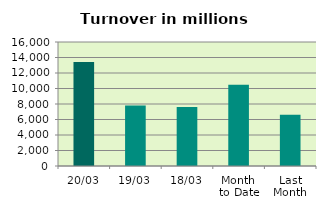
| Category | Series 0 |
|---|---|
| 20/03 | 13404.349 |
| 19/03 | 7818.194 |
| 18/03 | 7623.03 |
| Month 
to Date | 10470.623 |
| Last
Month | 6605.047 |